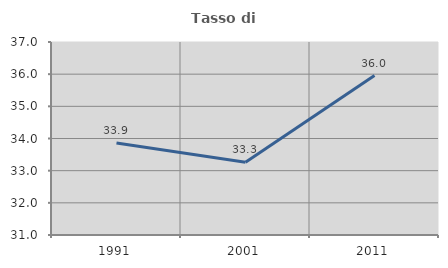
| Category | Tasso di occupazione   |
|---|---|
| 1991.0 | 33.862 |
| 2001.0 | 33.262 |
| 2011.0 | 35.957 |